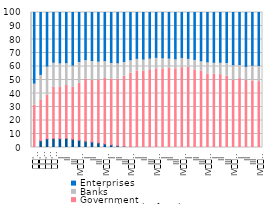
| Category | National Bank of Serbia | Government | Banks | Enterprises |
|---|---|---|---|---|
| 
'08 | 0 | 31.291 | 16.447 | 52.262 |
| 
'09 | 4.984 | 29.887 | 19.325 | 45.804 |
| 
'10 | 6.503 | 32.179 | 21.652 | 39.665 |
| 
'11 | 6.706 | 38.066 | 18.448 | 36.78 |
| I | 6.602 | 37.888 | 18.27 | 37.24 |
| II | 6.814 | 39.174 | 16.883 | 37.129 |
| III | 6.204 | 38.335 | 16.474 | 38.987 |
| IV
2012 | 5.415 | 42.098 | 16.181 | 36.306 |
| I | 4.685 | 46.019 | 14.432 | 34.864 |
| II | 4.172 | 45.685 | 14.545 | 35.598 |
| III | 3.477 | 46.517 | 14.026 | 35.98 |
| IV
2013 | 2.719 | 48.441 | 13.222 | 35.619 |
| I | 2.021 | 48.661 | 12.328 | 36.99 |
| II | 1.323 | 49.383 | 12.132 | 37.162 |
| III | 0.944 | 51.893 | 10.911 | 36.253 |
| IV
2014 | 0.591 | 54.493 | 9.967 | 34.949 |
| I | 0.407 | 56.273 | 9.408 | 33.912 |
| II | 0.194 | 56.26 | 9.127 | 34.418 |
| III | 0.112 | 56.908 | 9.265 | 33.715 |
| IV
2015 | 0.056 | 58.247 | 8.549 | 33.148 |
| I | 0.028 | 58.122 | 8.368 | 33.482 |
| II | 0 | 58.669 | 7.611 | 33.72 |
| III | 0 | 58.285 | 7.49 | 34.225 |
| IV
2016 | 0 | 59.181 | 7.541 | 33.278 |
| I | 0 | 59.435 | 6.62 | 33.944 |
| II | 0 | 57.473 | 7.843 | 34.684 |
| III | 0 | 56.361 | 7.899 | 35.74 |
| IV
2017 | 0 | 54.384 | 9.131 | 36.485 |
| I | 0 | 54.218 | 8.929 | 36.854 |
| II | 0 | 54.004 | 9.148 | 36.848 |
| III | 0 | 52.771 | 10.203 | 37.027 |
| IV
2018 | 0 | 49.898 | 11.402 | 38.699 |
| I | 0 | 51.033 | 10.471 | 38.496 |
| II | 0 | 49.827 | 10.292 | 39.881 |
| III | 0 | 49.289 | 11.631 | 39.081 |
| IV
2019 | 0 | 48.79 | 12.001 | 39.209 |